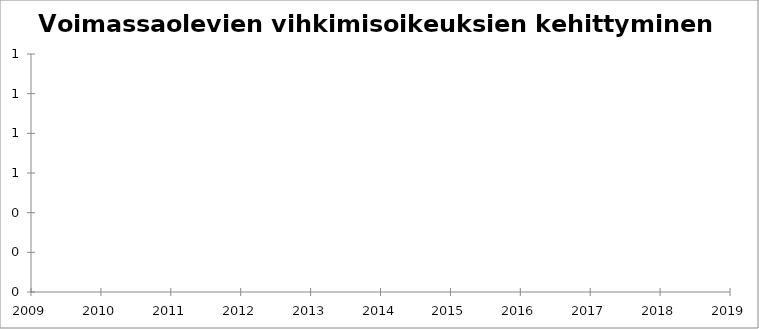
| Category | Series 0 |
|---|---|
| 2009 | 256 |
| 2010 | 518 |
| 2011 | 563 |
| 2012 | 601 |
| 2013 | 632 |
| 2014 | 651 |
| 2015 | 677 |
| 2016 | 723 |
| 2017 | 766 |
| 2018 | 818 |
| 2019 | 847 |